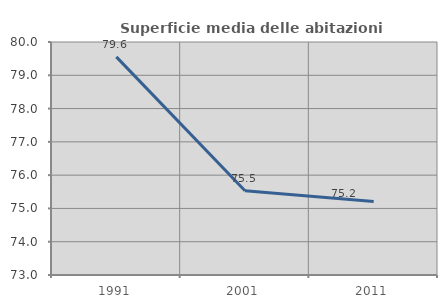
| Category | Superficie media delle abitazioni occupate |
|---|---|
| 1991.0 | 79.553 |
| 2001.0 | 75.53 |
| 2011.0 | 75.21 |